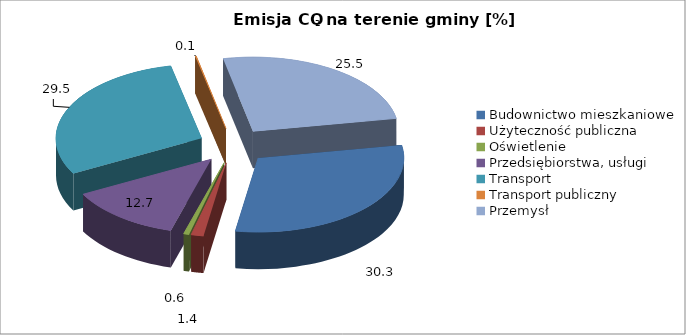
| Category | 30,3 1,4 0,6 12,7 29,5 0,1 25,5 |
|---|---|
| Budownictwo mieszkaniowe | 30.281 |
| Użyteczność publiczna | 1.373 |
| Oświetlenie | 0.612 |
| Przedsiębiorstwa, usługi | 12.662 |
| Transport | 29.45 |
| Transport publiczny | 0.116 |
| Przemysł | 25.507 |